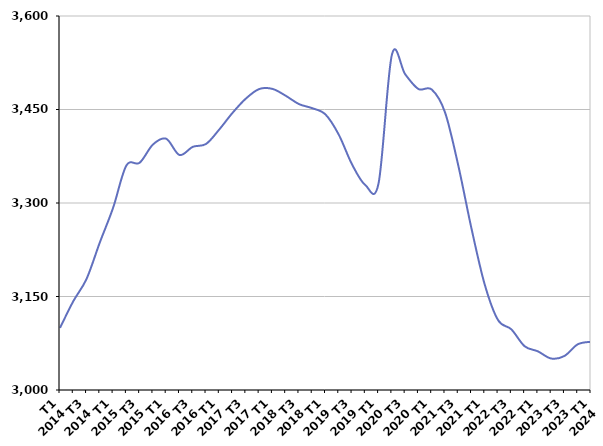
| Category | De 25 à 49 ans |
|---|---|
| T1
2014 | 3099.6 |
| T2
2014 | 3142.4 |
| T3
2014 | 3178.2 |
| T4
2014 | 3236.7 |
| T1
2015 | 3292.3 |
| T2
2015 | 3360.2 |
| T3
2015 | 3364.6 |
| T4
2015 | 3393.8 |
| T1
2016 | 3403.1 |
| T2
2016 | 3377 |
| T3
2016 | 3390.1 |
| T4
2016 | 3394.7 |
| T1
2017 | 3418 |
| T2
2017 | 3444.7 |
| T3
2017 | 3467.5 |
| T4
2017 | 3482.8 |
| T1
2018 | 3483.1 |
| T2
2018 | 3472.1 |
| T3
2018 | 3458.7 |
| T4
2018 | 3452.1 |
| T1
2019 | 3442 |
| T2
2019 | 3409.6 |
| T3
2019 | 3361.9 |
| T4
2019 | 3328.8 |
| T1
2020 | 3331.9 |
| T2
2020 | 3537.8 |
| T3
2020 | 3506.6 |
| T4
2020 | 3482.9 |
| T1
2021 | 3482.1 |
| T2
2021 | 3445.6 |
| T3
2021 | 3360.4 |
| T4
2021 | 3258.7 |
| T1
2022 | 3168.8 |
| T2
2022 | 3112.1 |
| T3
2022 | 3097.3 |
| T4
2022 | 3070.2 |
| T1
2023 | 3062 |
| T2
2023 | 3050.5 |
| T3
2023 | 3054.6 |
| T4
2023 | 3073.3 |
| T1
2024 | 3077.4 |